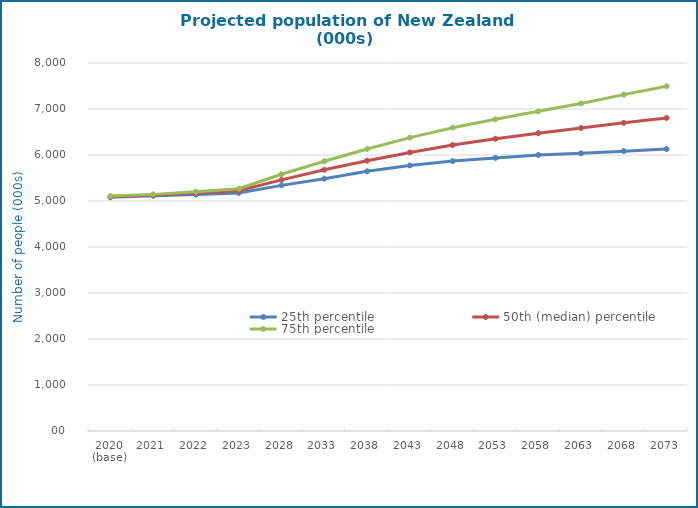
| Category | 25th percentile | 50th (median) percentile | 75th percentile |
|---|---|---|---|
| 2020 (base) | 5080 | 5094 | 5107 |
| 2021 | 5113 | 5129 | 5144 |
| 2022 | 5143 | 5173 | 5202 |
| 2023 | 5176 | 5222 | 5266 |
| 2028 | 5340 | 5460 | 5581 |
| 2033 | 5485 | 5679 | 5864 |
| 2038 | 5645 | 5876 | 6131 |
| 2043 | 5773 | 6056 | 6378 |
| 2048 | 5867 | 6216 | 6594 |
| 2053 | 5937 | 6353 | 6777 |
| 2058 | 6001 | 6474 | 6949 |
| 2063 | 6036 | 6587 | 7119 |
| 2068 | 6084 | 6699 | 7313 |
| 2073 | 6128 | 6806 | 7494 |